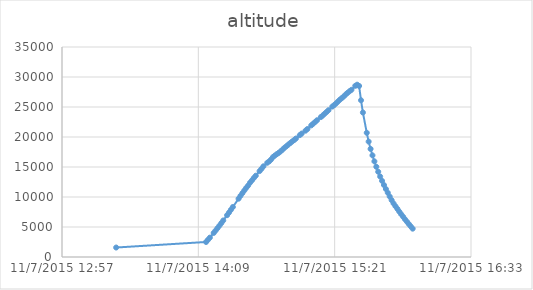
| Category | altitude |
|---|---|
| 42315.55986111111 | 1578.86 |
| 42315.592835648145 | 2503.63 |
| 42315.59353009259 | 2868.78 |
| 42315.59423611111 | 3230.58 |
| 42315.59563657407 | 4009.64 |
| 42315.59633101852 | 4405.58 |
| 42315.597037037034 | 4817.67 |
| 42315.59774305556 | 5230.67 |
| 42315.5984375 | 5652.52 |
| 42315.59914351852 | 6091.43 |
| 42315.60054398148 | 6966.51 |
| 42315.60125 | 7408.47 |
| 42315.60194444445 | 7865.36 |
| 42315.60265046296 | 8328.36 |
| 42315.60475694444 | 9718.24 |
| 42315.60545138889 | 10190.07 |
| 42315.606157407405 | 10642.09 |
| 42315.60686342593 | 11090.15 |
| 42315.60755787037 | 11518.09 |
| 42315.60826388889 | 11913.11 |
| 42315.60895833333 | 12384.02 |
| 42315.609664351854 | 12772.95 |
| 42315.61037037037 | 13178.94 |
| 42315.61106481482 | 13549.88 |
| 42315.61246527778 | 14317.07 |
| 42315.613171296296 | 14702.03 |
| 42315.61387731481 | 15115.03 |
| 42315.615277777775 | 15706.95 |
| 42315.6159837963 | 15931.9 |
| 42315.61667824074 | 16251.94 |
| 42315.61738425926 | 16657.93 |
| 42315.6180787037 | 16917.92 |
| 42315.618784722225 | 17140.73 |
| 42315.61949074074 | 17360.8 |
| 42315.62018518519 | 17609.82 |
| 42315.620891203704 | 17897.86 |
| 42315.62159722222 | 18207.84 |
| 42315.62229166667 | 18452.59 |
| 42315.62299768518 | 18732.7 |
| 42315.623703703706 | 18989.65 |
| 42315.624398148146 | 19247.82 |
| 42315.62510416667 | 19478.55 |
| 42315.62579861111 | 19746.77 |
| 42315.62721064815 | 20307.6 |
| 42315.627905092595 | 20573.7 |
| 42315.62931712963 | 21052.54 |
| 42315.630011574074 | 21331.43 |
| 42315.63141203704 | 21933.41 |
| 42315.63211805555 | 22217.48 |
| 42315.63282407408 | 22496.37 |
| 42315.633518518516 | 22786.54 |
| 42315.634930555556 | 23317.5 |
| 42315.635625 | 23580.55 |
| 42315.63633101852 | 23881.38 |
| 42315.637025462966 | 24167.29 |
| 42315.63773148148 | 24466.3 |
| 42315.639131944445 | 25071.32 |
| 42315.63983796296 | 25326.44 |
| 42315.640543981484 | 25611.43 |
| 42315.64125 | 25935.13 |
| 42315.64194444445 | 26229.26 |
| 42315.64263888889 | 26487.12 |
| 42315.64334490741 | 26765.1 |
| 42315.64405092593 | 27080.26 |
| 42315.64474537037 | 27367.08 |
| 42315.64545138889 | 27621.28 |
| 42315.646157407406 | 27867.25 |
| 42315.64755787037 | 28526.23 |
| 42315.648252314815 | 28716.12 |
| 42315.64895833333 | 28505.2 |
| 42315.649664351855 | 26123.19 |
| 42315.650358796294 | 24078.29 |
| 42315.651770833334 | 20699.58 |
| 42315.65246527778 | 19234.71 |
| 42315.6531712963 | 18013.68 |
| 42315.653865740744 | 16940.78 |
| 42315.65457175926 | 15940.74 |
| 42315.655277777776 | 15035.78 |
| 42315.65597222222 | 14200.94 |
| 42315.65667824074 | 13416.08 |
| 42315.65738425926 | 12687 |
| 42315.6580787037 | 11996.01 |
| 42315.658784722225 | 11333.07 |
| 42315.659479166665 | 10712.2 |
| 42315.66018518519 | 10085.22 |
| 42315.660891203705 | 9483.24 |
| 42315.66158564815 | 8933.38 |
| 42315.66229166667 | 8467.34 |
| 42315.662997685184 | 8021.42 |
| 42315.66369212963 | 7569.4 |
| 42315.66439814815 | 7130.49 |
| 42315.66509259259 | 6712.31 |
| 42315.66579861111 | 6283.45 |
| 42315.66650462963 | 5881.42 |
| 42315.66719907407 | 5491.58 |
| 42315.667905092596 | 5102.66 |
| 42315.66861111111 | 4723.49 |